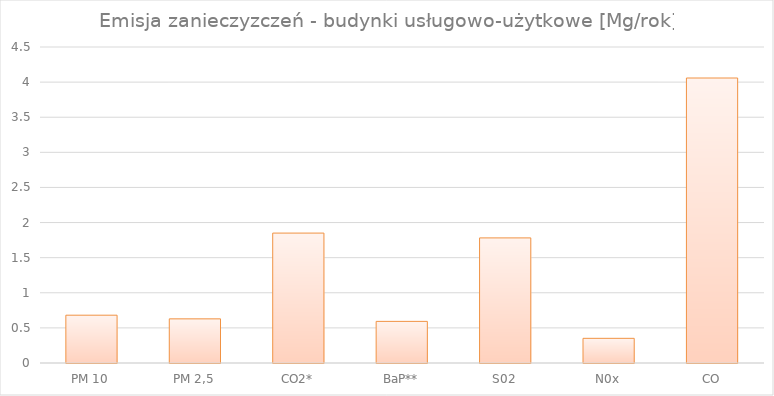
| Category | Series 0 |
|---|---|
| PM 10 | 0.681 |
| PM 2,5 | 0.629 |
| CO2* | 1.85 |
| BaP** | 0.593 |
| S02 | 1.782 |
| N0x | 0.351 |
| CO | 4.059 |